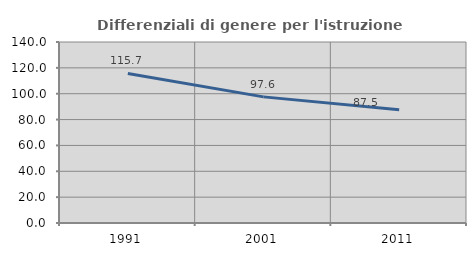
| Category | Differenziali di genere per l'istruzione superiore |
|---|---|
| 1991.0 | 115.667 |
| 2001.0 | 97.556 |
| 2011.0 | 87.531 |